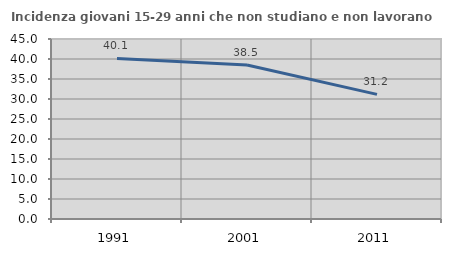
| Category | Incidenza giovani 15-29 anni che non studiano e non lavorano  |
|---|---|
| 1991.0 | 40.126 |
| 2001.0 | 38.489 |
| 2011.0 | 31.157 |